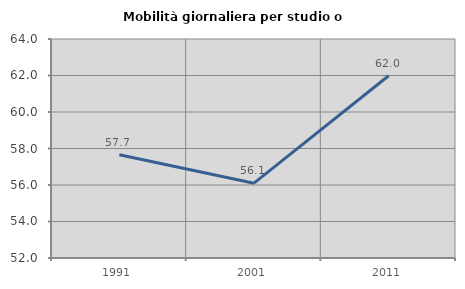
| Category | Mobilità giornaliera per studio o lavoro |
|---|---|
| 1991.0 | 57.655 |
| 2001.0 | 56.1 |
| 2011.0 | 61.986 |